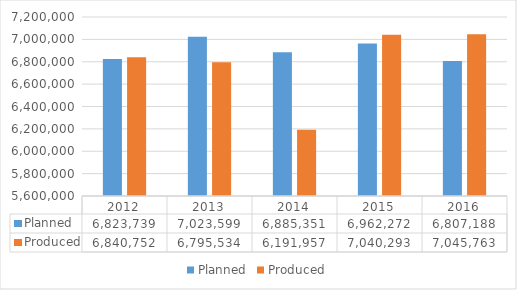
| Category | Planned | Produced |
|---|---|---|
| 2012.0 | 6823739 | 6840752 |
| 2013.0 | 7023599 | 6795534 |
| 2014.0 | 6885351 | 6191957 |
| 2015.0 | 6962272 | 7040293 |
| 2016.0 | 6807188 | 7045763 |